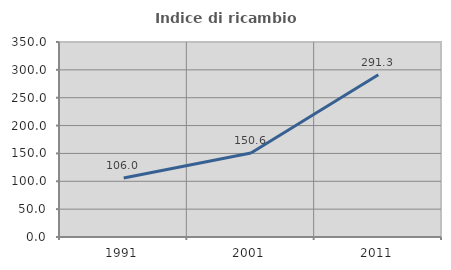
| Category | Indice di ricambio occupazionale  |
|---|---|
| 1991.0 | 106.004 |
| 2001.0 | 150.639 |
| 2011.0 | 291.333 |